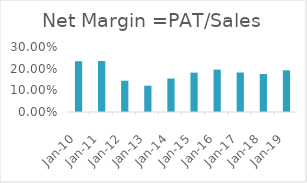
| Category | Net Margin =PAT/Sales |
|---|---|
| 2010-03-31 | 0.234 |
| 2011-03-31 | 0.235 |
| 2012-03-31 | 0.144 |
| 2013-03-31 | 0.121 |
| 2014-03-31 | 0.155 |
| 2015-03-31 | 0.182 |
| 2016-03-31 | 0.196 |
| 2017-03-31 | 0.182 |
| 2018-03-31 | 0.175 |
| 2019-03-31 | 0.192 |